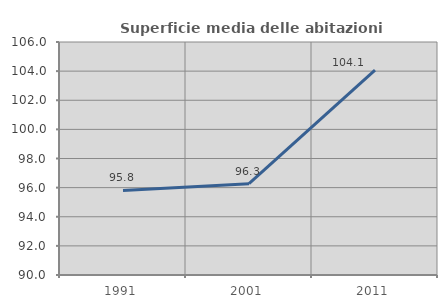
| Category | Superficie media delle abitazioni occupate |
|---|---|
| 1991.0 | 95.81 |
| 2001.0 | 96.267 |
| 2011.0 | 104.072 |